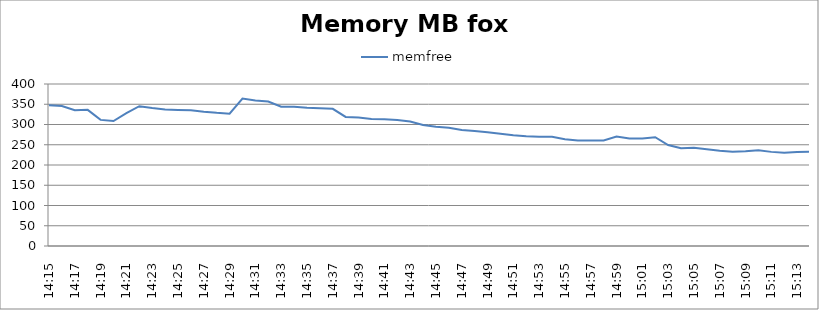
| Category | memfree |
|---|---|
| 14:15 | 347.8 |
| 14:16 | 345.7 |
| 14:17 | 335.2 |
| 14:18 | 336.2 |
| 14:19 | 311.4 |
| 14:20 | 308.5 |
| 14:21 | 327.8 |
| 14:22 | 345.2 |
| 14:23 | 340.6 |
| 14:24 | 337 |
| 14:25 | 336.1 |
| 14:26 | 335.4 |
| 14:27 | 331.7 |
| 14:28 | 328.8 |
| 14:29 | 326.7 |
| 14:30 | 363.9 |
| 14:31 | 359.5 |
| 14:32 | 356.9 |
| 14:33 | 343.8 |
| 14:34 | 344 |
| 14:35 | 341.2 |
| 14:36 | 340.4 |
| 14:37 | 338.8 |
| 14:38 | 318.7 |
| 14:39 | 317.1 |
| 14:40 | 313.8 |
| 14:41 | 313 |
| 14:42 | 311.4 |
| 14:43 | 307.6 |
| 14:44 | 299 |
| 14:45 | 294.4 |
| 14:46 | 291.9 |
| 14:47 | 286.7 |
| 14:48 | 284 |
| 14:49 | 281.1 |
| 14:50 | 277.4 |
| 14:51 | 273.5 |
| 14:52 | 271.1 |
| 14:53 | 269.9 |
| 14:54 | 269.5 |
| 14:55 | 263.7 |
| 14:56 | 260.7 |
| 14:57 | 260.8 |
| 14:58 | 260.7 |
| 14:59 | 270.5 |
| 15:00 | 265.4 |
| 15:01 | 265.6 |
| 15:02 | 268.6 |
| 15:03 | 249.4 |
| 15:04 | 241.4 |
| 15:05 | 242.5 |
| 15:06 | 239.1 |
| 15:07 | 235.3 |
| 15:08 | 232.9 |
| 15:09 | 233.7 |
| 15:10 | 236.4 |
| 15:11 | 232.4 |
| 15:12 | 230.4 |
| 15:13 | 231.8 |
| 15:14 | 232.6 |